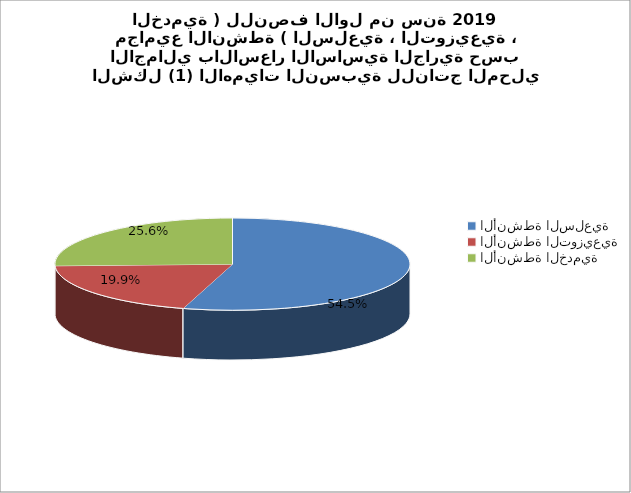
| Category | Series 0 |
|---|---|
| الأنشطة السلعية | 70484.7 |
| الأنشطة التوزيعية | 25795.1 |
| الأنشطة الخدمية | 33073.9 |